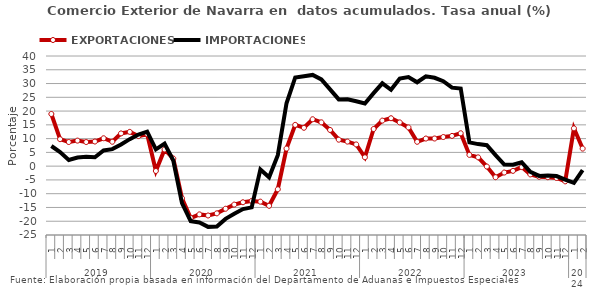
| Category | EXPORTACIONES | IMPORTACIONES |
|---|---|---|
| 0 | 18.948 | 7.315 |
| 1 | 9.797 | 5.099 |
| 2 | 8.76 | 2.252 |
| 3 | 9.273 | 3.156 |
| 4 | 8.751 | 3.402 |
| 5 | 8.941 | 3.214 |
| 6 | 10.129 | 5.68 |
| 7 | 8.858 | 6.185 |
| 8 | 11.886 | 7.856 |
| 9 | 12.45 | 9.803 |
| 10 | 10.916 | 11.49 |
| 11 | 11.592 | 12.546 |
| 12 | -1.752 | 6.106 |
| 13 | 6.06 | 8.195 |
| 14 | 2.767 | 2.044 |
| 15 | -11.66 | -13.436 |
| 16 | -18.842 | -19.985 |
| 17 | -17.518 | -20.463 |
| 18 | -17.915 | -22.045 |
| 19 | -17.138 | -21.942 |
| 20 | -15.468 | -19.148 |
| 21 | -13.958 | -17.302 |
| 22 | -13.111 | -15.592 |
| 23 | -12.618 | -14.979 |
| 24 | -12.891 | -1.187 |
| 25 | -14.395 | -4.032 |
| 26 | -8.397 | 3.981 |
| 27 | 6.384 | 22.846 |
| 28 | 14.986 | 32.204 |
| 29 | 13.93 | 32.661 |
| 30 | 17.036 | 33.128 |
| 31 | 15.917 | 31.478 |
| 32 | 13.143 | 27.878 |
| 33 | 9.616 | 24.246 |
| 34 | 8.917 | 24.256 |
| 35 | 7.885 | 23.582 |
| 36 | 3.221 | 22.748 |
| 37 | 13.487 | 26.51 |
| 38 | 16.546 | 30.085 |
| 39 | 17.402 | 27.741 |
| 40 | 15.883 | 31.779 |
| 41 | 14.059 | 32.379 |
| 42 | 8.846 | 30.466 |
| 43 | 10.029 | 32.607 |
| 44 | 10.043 | 32.095 |
| 45 | 10.577 | 30.854 |
| 46 | 10.982 | 28.507 |
| 47 | 11.94 | 28.19 |
| 48 | 4.092 | 8.62 |
| 49 | 3.195 | 8.01 |
| 50 | -0.137 | 7.62 |
| 51 | -4.01 | 3.983 |
| 52 | -2.321 | 0.596 |
| 53 | -1.713 | 0.526 |
| 54 | -0.34 | 1.382 |
| 55 | -2.999 | -2.064 |
| 56 | -3.849 | -3.545 |
| 57 | -4.021 | -3.352 |
| 58 | -4.296 | -3.6 |
| 59 | -5.523 | -4.91 |
| 60 | 13.735 | -6.091 |
| 61 | 6.384 | -1.464 |